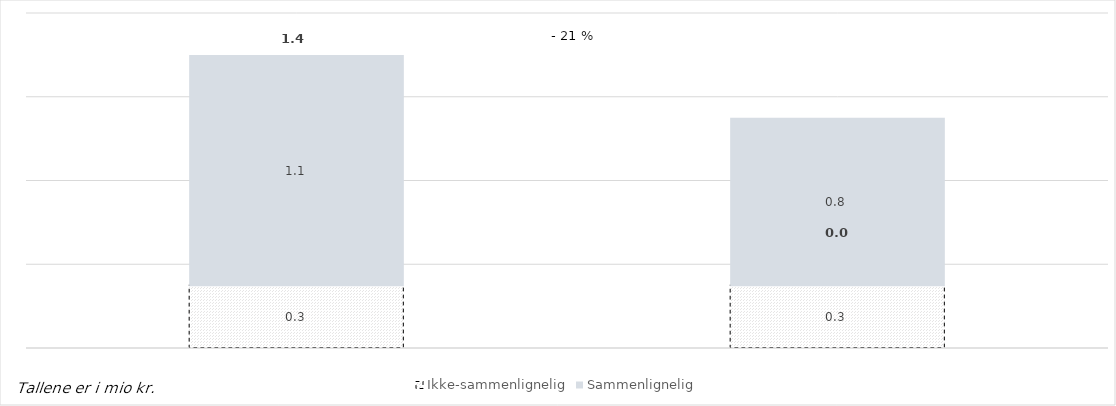
| Category | Series 0 | Ikke-sammenlignelig | Sammenlignelig |
|---|---|---|---|
|  |  | 0.3 | 1.1 |
|  |  | 0.3 | 0.8 |